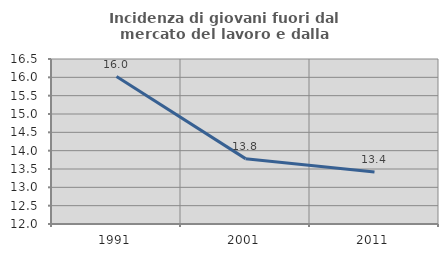
| Category | Incidenza di giovani fuori dal mercato del lavoro e dalla formazione  |
|---|---|
| 1991.0 | 16.021 |
| 2001.0 | 13.783 |
| 2011.0 | 13.42 |